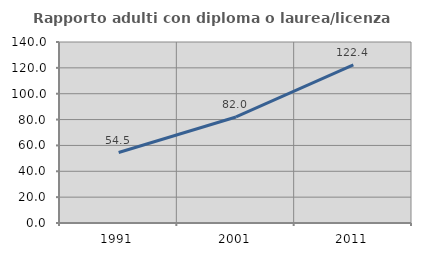
| Category | Rapporto adulti con diploma o laurea/licenza media  |
|---|---|
| 1991.0 | 54.523 |
| 2001.0 | 81.995 |
| 2011.0 | 122.398 |